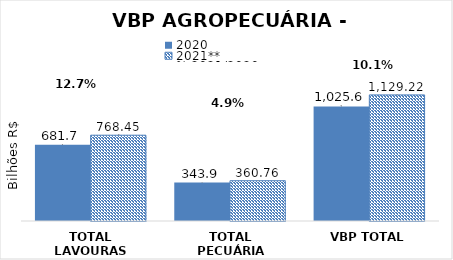
| Category | 2020 | 2021** |
|---|---|---|
| TOTAL LAVOURAS | 681.749 | 768.454 |
| TOTAL PECUÁRIA | 343.866 | 360.761 |
| VBP TOTAL | 1025.616 | 1129.215 |